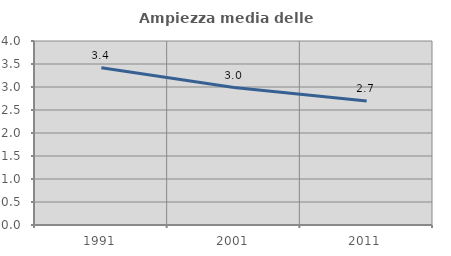
| Category | Ampiezza media delle famiglie |
|---|---|
| 1991.0 | 3.417 |
| 2001.0 | 2.988 |
| 2011.0 | 2.698 |